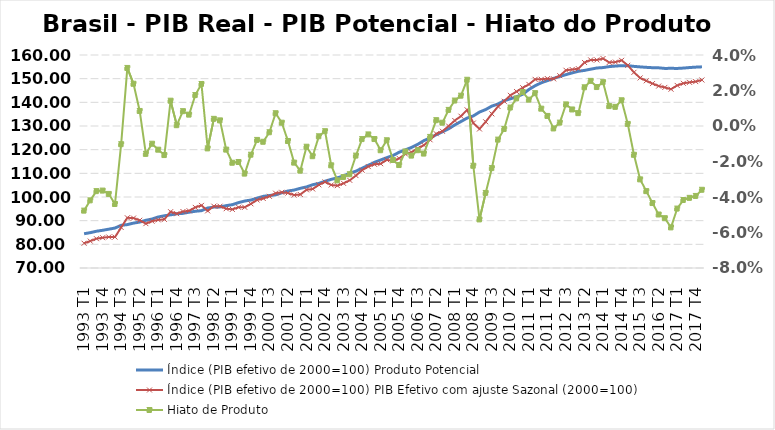
| Category | Índice (PIB efetivo de 2000=100) |
|---|---|
| 1993 T1 | 80.458 |
| 1993 T2 | 81.375 |
| 1993 T3 | 82.392 |
| 1993 T4 | 82.806 |
| 1994 T1 | 83.093 |
| 1994 T2 | 83.066 |
| 1994 T3 | 87.127 |
| 1994 T4 | 91.225 |
| 1995 T1 | 91.096 |
| 1995 T2 | 90.159 |
| 1995 T3 | 88.742 |
| 1995 T4 | 89.773 |
| 1996 T1 | 90.335 |
| 1996 T2 | 90.551 |
| 1996 T3 | 93.786 |
| 1996 T4 | 92.947 |
| 1997 T1 | 93.868 |
| 1997 T2 | 94.183 |
| 1997 T3 | 95.605 |
| 1997 T4 | 96.455 |
| 1998 T1 | 94.135 |
| 1998 T2 | 96.116 |
| 1998 T3 | 96.109 |
| 1998 T4 | 95.054 |
| 1999 T1 | 94.762 |
| 1999 T2 | 95.654 |
| 1999 T3 | 95.656 |
| 1999 T4 | 97.121 |
| 2000 T1 | 98.728 |
| 2000 T2 | 99.379 |
| 2000 T3 | 100.278 |
| 2000 T4 | 101.616 |
| 2001 T1 | 101.986 |
| 2001 T2 | 101.669 |
| 2001 T3 | 100.815 |
| 2001 T4 | 101.062 |
| 2002 T1 | 103.035 |
| 2002 T2 | 103.389 |
| 2002 T3 | 105.133 |
| 2002 T4 | 106.362 |
| 2003 T1 | 105.078 |
| 2003 T2 | 104.793 |
| 2003 T3 | 105.764 |
| 2003 T4 | 107.046 |
| 2004 T1 | 109.055 |
| 2004 T2 | 111.334 |
| 2004 T3 | 112.848 |
| 2004 T4 | 113.81 |
| 2005 T1 | 114.066 |
| 2005 T2 | 115.687 |
| 2005 T3 | 115.283 |
| 2005 T4 | 116.302 |
| 2006 T1 | 118.187 |
| 2006 T2 | 118.926 |
| 2006 T3 | 120.584 |
| 2006 T4 | 121.897 |
| 2007 T1 | 124.175 |
| 2007 T2 | 126.73 |
| 2007 T3 | 127.773 |
| 2007 T4 | 129.98 |
| 2008 T1 | 132.326 |
| 2008 T2 | 134.146 |
| 2008 T3 | 136.831 |
| 2008 T4 | 131.248 |
| 2009 T1 | 128.736 |
| 2009 T2 | 131.779 |
| 2009 T3 | 135.128 |
| 2009 T4 | 138.235 |
| 2010 T1 | 140.445 |
| 2010 T2 | 142.959 |
| 2010 T3 | 144.561 |
| 2010 T4 | 146.176 |
| 2011 T1 | 147.578 |
| 2011 T2 | 149.711 |
| 2011 T3 | 149.715 |
| 2011 T4 | 150.02 |
| 2012 T1 | 149.921 |
| 2012 T2 | 151.234 |
| 2012 T3 | 153.549 |
| 2012 T4 | 153.863 |
| 2013 T1 | 154.232 |
| 2013 T2 | 156.843 |
| 2013 T3 | 157.924 |
| 2013 T4 | 157.905 |
| 2014 T1 | 158.505 |
| 2014 T2 | 156.843 |
| 2014 T3 | 156.999 |
| 2014 T4 | 157.755 |
| 2015 T1 | 155.651 |
| 2015 T2 | 152.676 |
| 2015 T3 | 150.311 |
| 2015 T4 | 149.105 |
| 2016 T1 | 147.922 |
| 2016 T2 | 146.875 |
| 2016 T3 | 146.312 |
| 2016 T4 | 145.552 |
| 2017 T1 | 147.144 |
| 2017 T2 | 148.033 |
| 2017 T3 | 148.436 |
| 2017 T4 | 148.767 |
| 2018 T1 | 149.434 |